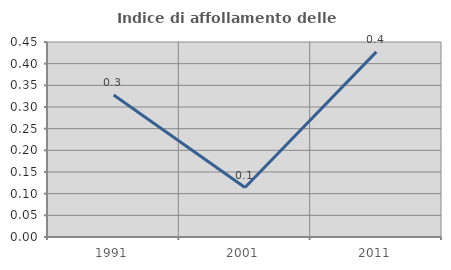
| Category | Indice di affollamento delle abitazioni  |
|---|---|
| 1991.0 | 0.328 |
| 2001.0 | 0.114 |
| 2011.0 | 0.427 |